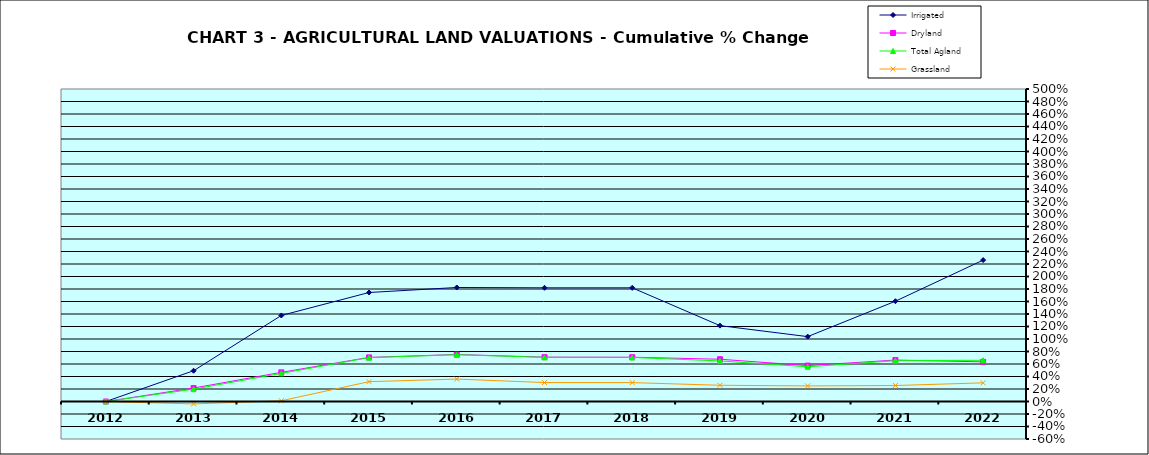
| Category | Irrigated | Dryland | Total Agland | Grassland |
|---|---|---|---|---|
| 2012.0 | 0 | 0 | 0 | 0 |
| 2013.0 | 0.492 | 0.215 | 0.197 | -0.039 |
| 2014.0 | 1.377 | 0.466 | 0.45 | 0.012 |
| 2015.0 | 1.744 | 0.706 | 0.702 | 0.317 |
| 2016.0 | 1.824 | 0.752 | 0.748 | 0.359 |
| 2017.0 | 1.819 | 0.71 | 0.706 | 0.303 |
| 2018.0 | 1.819 | 0.708 | 0.705 | 0.302 |
| 2019.0 | 1.214 | 0.676 | 0.649 | 0.26 |
| 2020.0 | 1.038 | 0.574 | 0.555 | 0.25 |
| 2021.0 | 1.605 | 0.663 | 0.653 | 0.256 |
| 2022.0 | 2.262 | 0.634 | 0.66 | 0.298 |